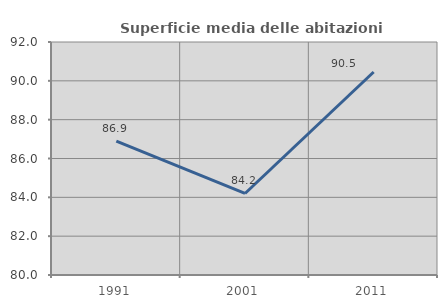
| Category | Superficie media delle abitazioni occupate |
|---|---|
| 1991.0 | 86.899 |
| 2001.0 | 84.199 |
| 2011.0 | 90.456 |